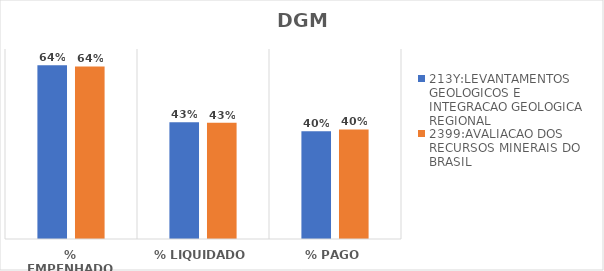
| Category | 213Y:LEVANTAMENTOS GEOLOGICOS E INTEGRACAO GEOLOGICA REGIONAL | 2399:AVALIACAO DOS RECURSOS MINERAIS DO BRASIL |
|---|---|---|
| % EMPENHADO | 0.64 | 0.636 |
| % LIQUIDADO | 0.43 | 0.428 |
| % PAGO | 0.397 | 0.404 |